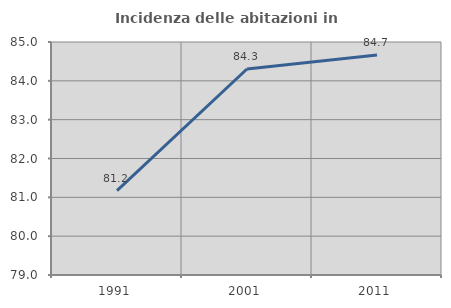
| Category | Incidenza delle abitazioni in proprietà  |
|---|---|
| 1991.0 | 81.174 |
| 2001.0 | 84.305 |
| 2011.0 | 84.668 |